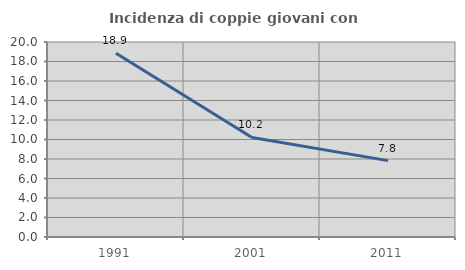
| Category | Incidenza di coppie giovani con figli |
|---|---|
| 1991.0 | 18.853 |
| 2001.0 | 10.206 |
| 2011.0 | 7.833 |